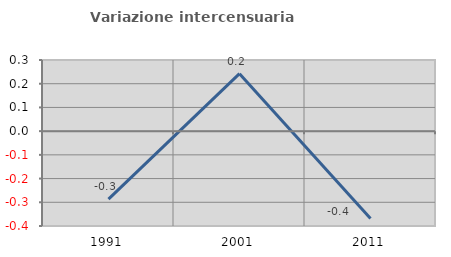
| Category | Variazione intercensuaria annua |
|---|---|
| 1991.0 | -0.287 |
| 2001.0 | 0.242 |
| 2011.0 | -0.368 |